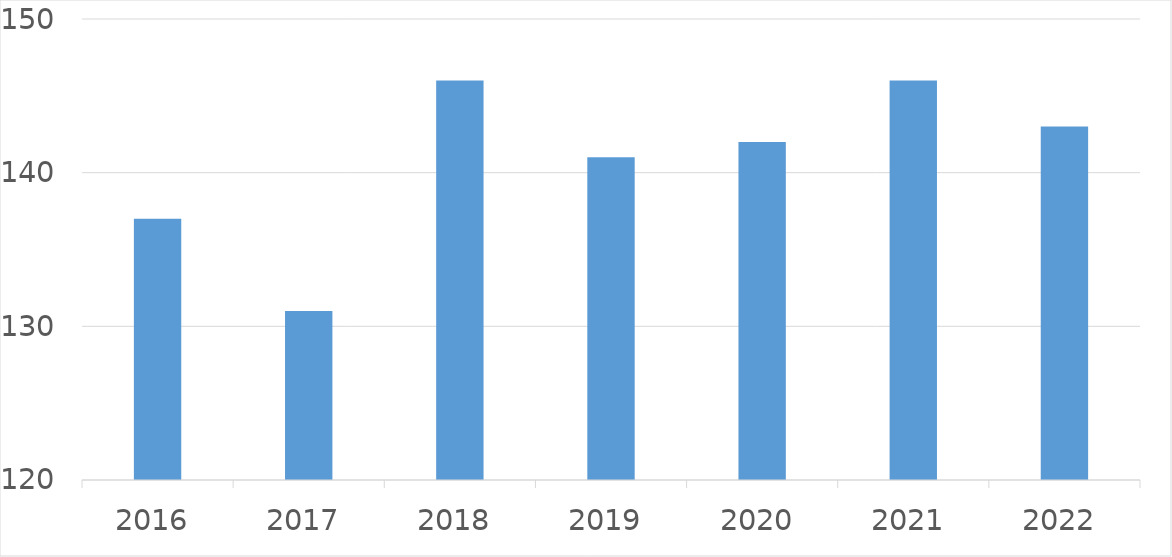
| Category | Series 0 |
|---|---|
| 2016 | 137 |
| 2017 | 131 |
| 2018 | 146 |
| 2019 | 141 |
| 2020 | 142 |
| 2021 | 146 |
| 2022 | 143 |